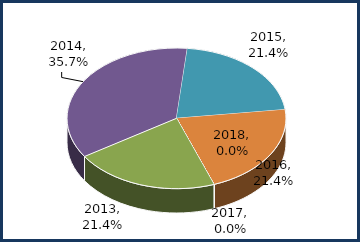
| Category | Series 0 |
|---|---|
| 2011.0 | 0 |
| 2012.0 | 0 |
| 2013.0 | 0.214 |
| 2014.0 | 0.357 |
| 2015.0 | 0.214 |
| 2016.0 | 0.214 |
| 2017.0 | 0 |
| 2018.0 | 0 |